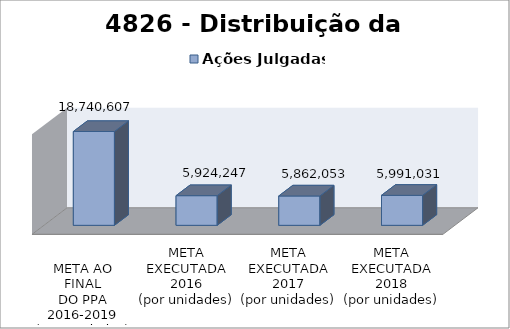
| Category | Ações Julgadas |
|---|---|
| 
META AO FINAL
DO PPA
2016-2019
(por unidades)
 | 18740607 |
| META EXECUTADA
2016
(por unidades) | 5924247 |
| META EXECUTADA
2017
(por unidades) | 5862053 |
| META EXECUTADA
2018
(por unidades) | 5991031 |